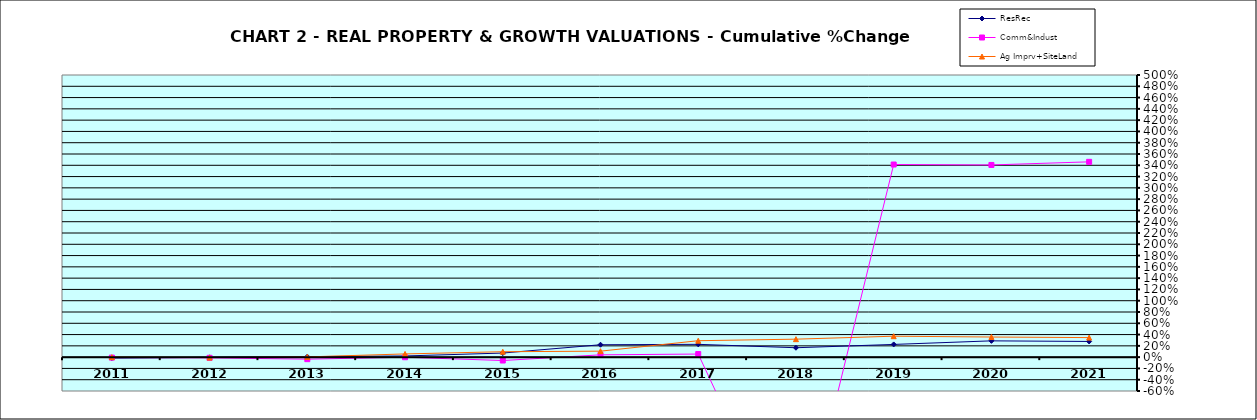
| Category | ResRec | Comm&Indust | Ag Imprv+SiteLand |
|---|---|---|---|
| 2011.0 | -0.017 | -0.008 | 0 |
| 2012.0 | -0.004 | -0.012 | -0.008 |
| 2013.0 | 0.009 | -0.036 | 0.004 |
| 2014.0 | 0.021 | -0.002 | 0.057 |
| 2015.0 | 0.073 | -0.06 | 0.096 |
| 2016.0 | 0.22 | 0.041 | 0.106 |
| 2017.0 | 0.227 | 0.055 | 0.291 |
| 2018.0 | 0.167 | -3.641 | 0.319 |
| 2019.0 | 0.225 | 3.414 | 0.371 |
| 2020.0 | 0.289 | 3.406 | 0.357 |
| 2021.0 | 0.278 | 3.461 | 0.346 |